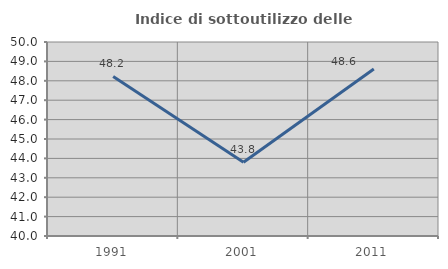
| Category | Indice di sottoutilizzo delle abitazioni  |
|---|---|
| 1991.0 | 48.227 |
| 2001.0 | 43.803 |
| 2011.0 | 48.611 |